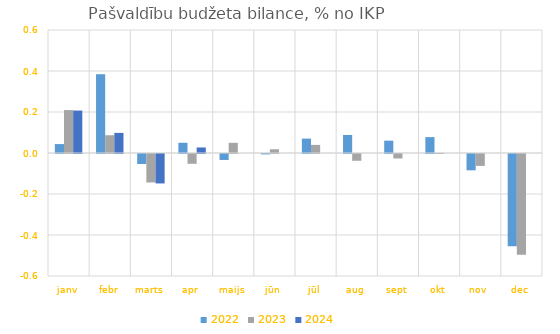
| Category | 2022 | 2023 | 2024 |
|---|---|---|---|
| janv | 0.044 | 0.209 | 0.207 |
| febr | 0.384 | 0.087 | 0.098 |
| marts | -0.049 | -0.139 | -0.144 |
| apr | 0.05 | -0.048 | 0.027 |
| maijs | -0.029 | 0.05 | 0 |
| jūn | -0.002 | 0.018 | 0 |
| jūl | 0.07 | 0.04 | 0 |
| aug | 0.088 | -0.033 | 0 |
| sept | 0.06 | -0.022 | 0 |
| okt | 0.077 | 0 | 0 |
| nov | -0.08 | -0.058 | 0 |
| dec | -0.451 | -0.491 | 0 |